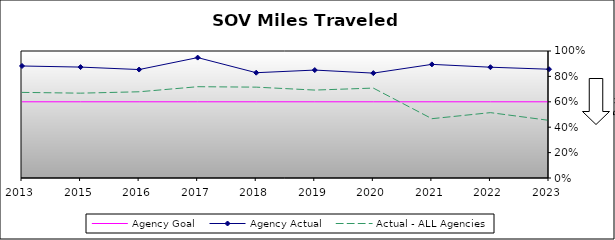
| Category | Agency Goal | Agency Actual | Actual - ALL Agencies |
|---|---|---|---|
| 2013.0 | 0.6 | 0.882 | 0.674 |
| 2015.0 | 0.6 | 0.873 | 0.668 |
| 2016.0 | 0.6 | 0.854 | 0.679 |
| 2017.0 | 0.6 | 0.948 | 0.719 |
| 2018.0 | 0.6 | 0.829 | 0.715 |
| 2019.0 | 0.6 | 0.85 | 0.692 |
| 2020.0 | 0.6 | 0.826 | 0.708 |
| 2021.0 | 0.6 | 0.895 | 0.467 |
| 2022.0 | 0.6 | 0.872 | 0.515 |
| 2023.0 | 0.6 | 0.856 | 0.454 |